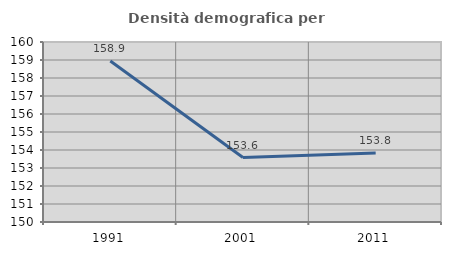
| Category | Densità demografica |
|---|---|
| 1991.0 | 158.941 |
| 2001.0 | 153.579 |
| 2011.0 | 153.838 |